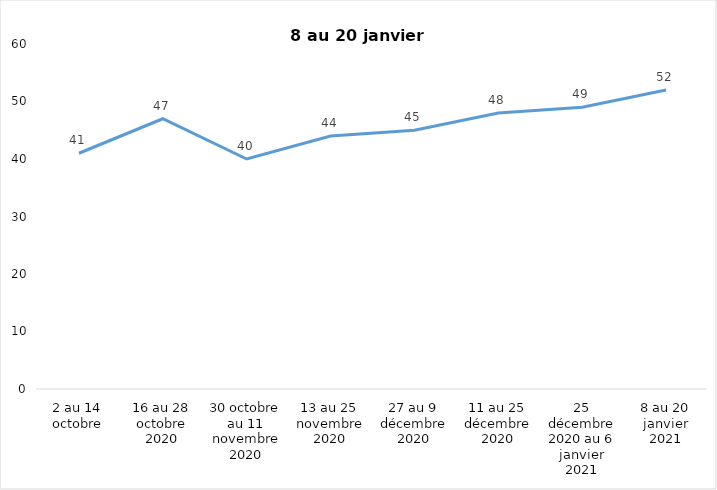
| Category | Toujours aux trois mesures |
|---|---|
| 2 au 14 octobre | 41 |
| 16 au 28 octobre 2020 | 47 |
| 30 octobre au 11 novembre 2020 | 40 |
| 13 au 25 novembre 2020 | 44 |
| 27 au 9 décembre 2020 | 45 |
| 11 au 25 décembre 2020 | 48 |
| 25 décembre 2020 au 6 janvier 2021 | 49 |
| 8 au 20 janvier 2021 | 52 |